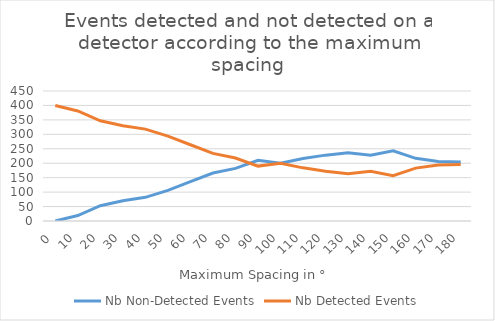
| Category | Nb Non-Detected Events | Nb Detected Events |
|---|---|---|
| 0.0 | 0 | 400 |
| 10.0 | 19 | 381 |
| 20.0 | 53 | 347 |
| 30.0 | 70 | 330 |
| 40.0 | 82 | 318 |
| 50.0 | 106 | 294 |
| 60.0 | 136 | 264 |
| 70.0 | 166 | 234 |
| 80.0 | 182 | 218 |
| 90.0 | 210 | 190 |
| 100.0 | 200 | 200 |
| 110.0 | 216 | 184 |
| 120.0 | 228 | 172 |
| 130.0 | 236 | 164 |
| 140.0 | 228 | 172 |
| 150.0 | 243 | 157 |
| 160.0 | 217 | 183 |
| 170.0 | 206 | 194 |
| 180.0 | 204 | 196 |